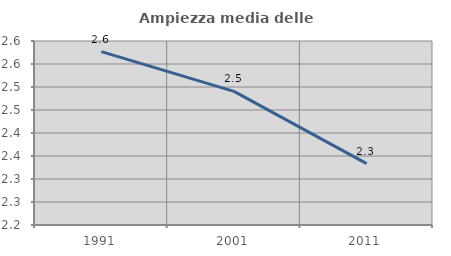
| Category | Ampiezza media delle famiglie |
|---|---|
| 1991.0 | 2.577 |
| 2001.0 | 2.491 |
| 2011.0 | 2.333 |